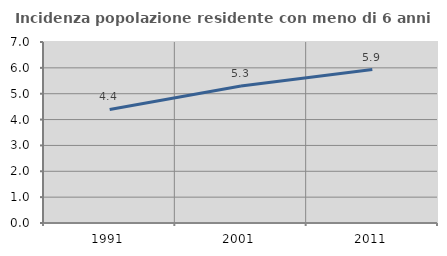
| Category | Incidenza popolazione residente con meno di 6 anni |
|---|---|
| 1991.0 | 4.39 |
| 2001.0 | 5.295 |
| 2011.0 | 5.933 |